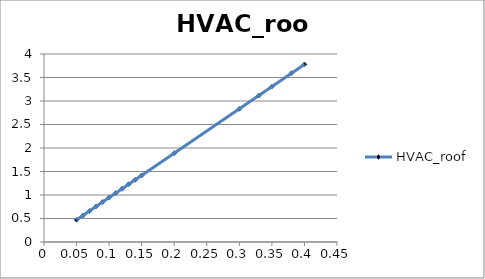
| Category | HVAC_roof |
|---|---|
| 0.05 | 0.472 |
| 0.06 | 0.567 |
| 0.07 | 0.661 |
| 0.08 | 0.756 |
| 0.09 | 0.85 |
| 0.1 | 0.945 |
| 0.11 | 1.039 |
| 0.12 | 1.133 |
| 0.13 | 1.228 |
| 0.14 | 1.322 |
| 0.15 | 1.417 |
| 0.2 | 1.889 |
| 0.3 | 2.834 |
| 0.33 | 3.117 |
| 0.35 | 3.306 |
| 0.38 | 3.589 |
| 0.4 | 3.778 |